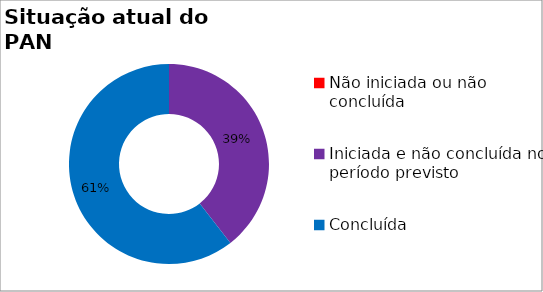
| Category | Series 0 |
|---|---|
| Não iniciada ou não concluída | 0 |
| Iniciada e não concluída no período previsto | 0.395 |
| Concluída | 0.605 |